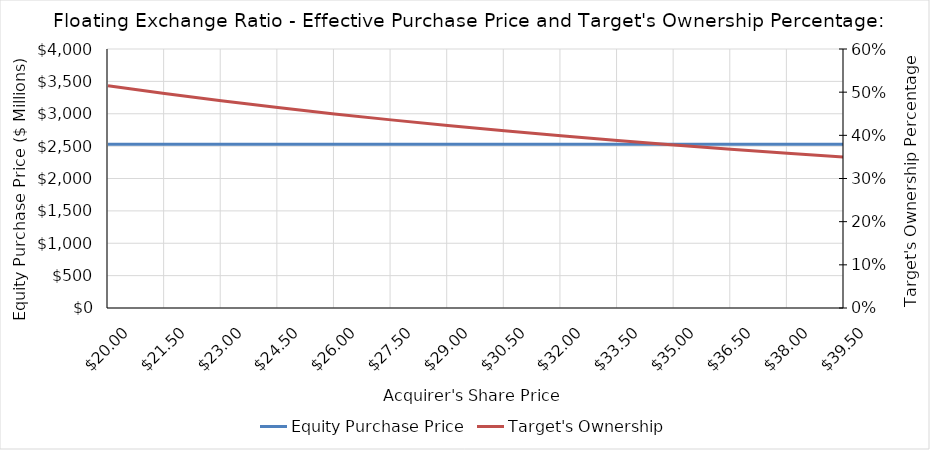
| Category | Equity Purchase Price |
|---|---|
| 20.0 | 2529.585 |
| 21.5 | 2529.585 |
| 23.0 | 2529.585 |
| 24.5 | 2529.585 |
| 26.0 | 2529.585 |
| 27.5 | 2529.585 |
| 29.0 | 2529.585 |
| 30.5 | 2529.585 |
| 32.0 | 2529.585 |
| 33.5 | 2529.585 |
| 35.0 | 2529.585 |
| 36.5 | 2529.585 |
| 38.0 | 2529.585 |
| 39.5 | 2529.585 |